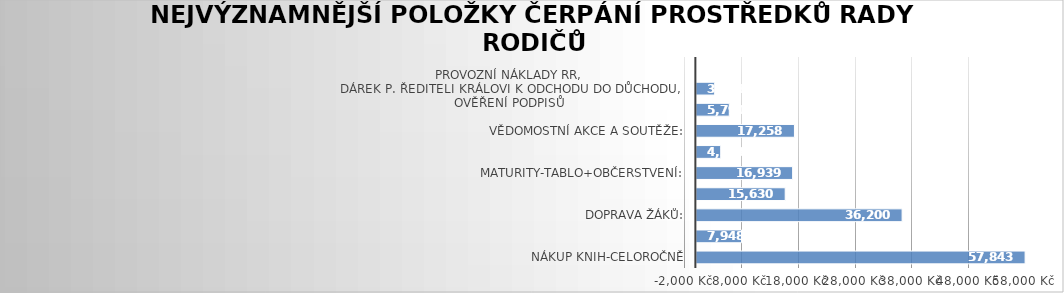
| Category | Series 0 |
|---|---|
| nákup knih-celoročně | 57843 |
| sportovní nářadí: | 7948 |
| doprava žáků: | 36200 |
| sportovní turnaje -startovné,odměny | 15630 |
| maturity-tablo+občerstvení: | 16939 |
| trička CANIS | 4283 |
| vědomostní akce a soutěže: | 17258 |
| odměna pokladníka: | 5790 |
| provozní náklady RR,
 dárek p. řediteli Královi k odchodu do důchodu,
ověření podpisů | 3218 |